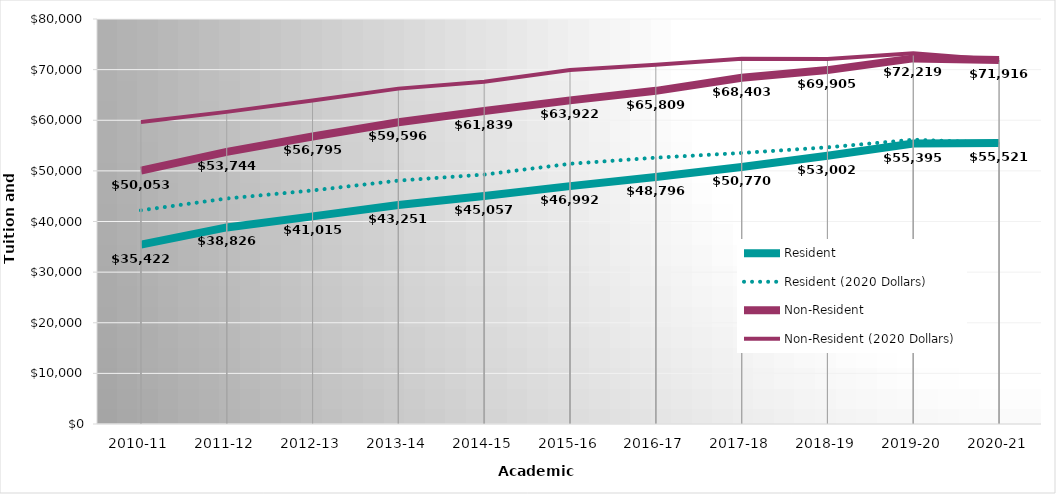
| Category | Resident | Resident (2020 Dollars) | Non-Resident | Non-Resident (2020 Dollars) |
|---|---|---|---|---|
| 2010-11 | 35422 | 42206.92 | 50053 | 59640.43 |
| 2011-12 | 38826 | 44539.98 | 53744 | 61653.44 |
| 2012-13 | 41015 | 46132.5 | 56795 | 63881.4 |
| 2013-14 | 43251 | 48077.81 | 59596 | 66246.91 |
| 2014-15 | 45057 | 49268.52 | 61839 | 67619.15 |
| 2015-16 | 46992 | 51402.96 | 63922 | 69922.12 |
| 2016-17 | 48796 | 52606.25 | 65809 | 70947.72 |
| 2017-18 | 50770 | 53538.89 | 68403 | 72133.56 |
| 2018-19 | 53002 | 54648.29 | 69905 | 72076.32 |
| 2019-20 | 55395 | 56154.65 | 72219 | 73209.36 |
| 2020-21 | 55521 | 55521 | 71916 | 71916 |